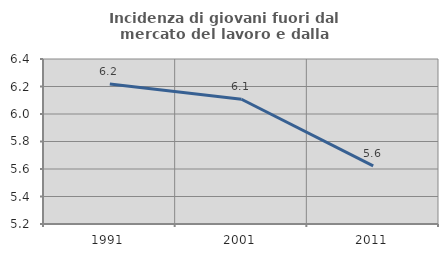
| Category | Incidenza di giovani fuori dal mercato del lavoro e dalla formazione  |
|---|---|
| 1991.0 | 6.218 |
| 2001.0 | 6.107 |
| 2011.0 | 5.622 |